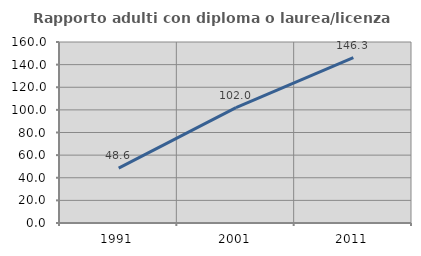
| Category | Rapporto adulti con diploma o laurea/licenza media  |
|---|---|
| 1991.0 | 48.558 |
| 2001.0 | 102.016 |
| 2011.0 | 146.256 |